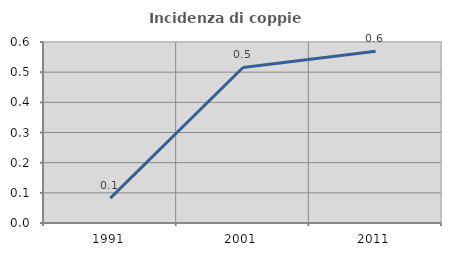
| Category | Incidenza di coppie miste |
|---|---|
| 1991.0 | 0.083 |
| 2001.0 | 0.516 |
| 2011.0 | 0.569 |